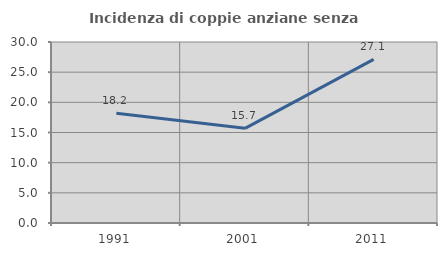
| Category | Incidenza di coppie anziane senza figli  |
|---|---|
| 1991.0 | 18.182 |
| 2001.0 | 15.686 |
| 2011.0 | 27.119 |